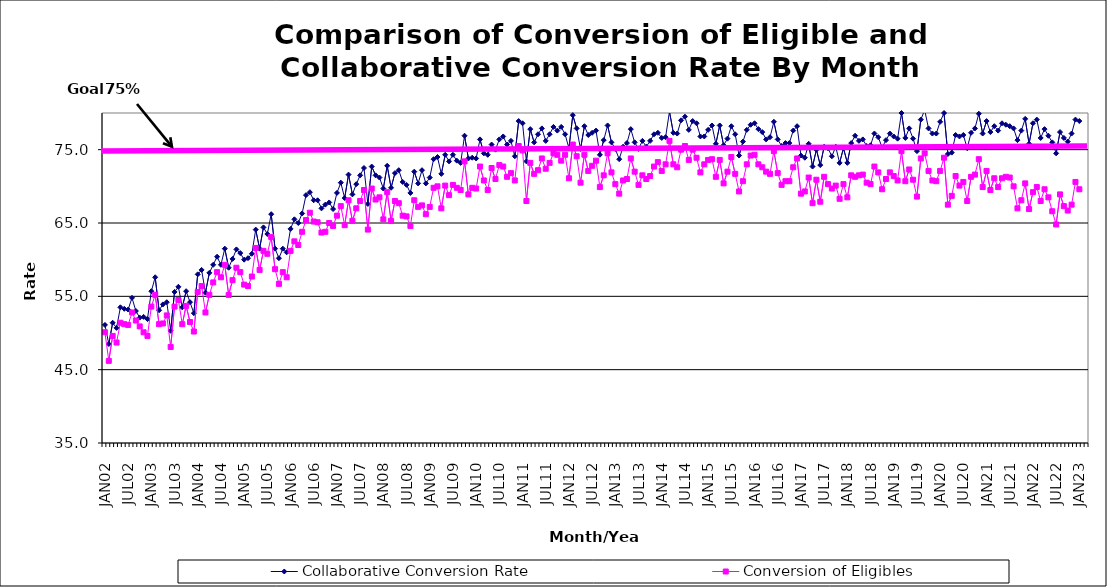
| Category | Collaborative Conversion Rate | Conversion of Eligibles |
|---|---|---|
| JAN02 | 51.1 | 50.1 |
| FEB02 | 48.5 | 46.2 |
| MAR02 | 51.4 | 49.6 |
| APR02 | 50.7 | 48.7 |
| MAY02 | 53.5 | 51.4 |
| JUN02 | 53.3 | 51.2 |
| JUL02 | 53.2 | 51.1 |
| AUG02 | 54.8 | 52.8 |
| SEP02 | 53 | 51.7 |
| OCT02 | 52.1 | 50.9 |
| NOV02 | 52.2 | 50.1 |
| DEC02 | 51.9 | 49.6 |
| JAN03 | 55.7 | 53.6 |
| FEB03 | 57.6 | 55.2 |
| MAR03 | 53.1 | 51.2 |
| APR03 | 53.9 | 51.3 |
| MAY03 | 54.2 | 52.4 |
| JUN03 | 50.3 | 48.1 |
| JUL03 | 55.6 | 53.6 |
| AUG03 | 56.3 | 54.5 |
| SEP03 | 53.5 | 51.2 |
| OCT03 | 55.7 | 53.7 |
| NOV03 | 54.2 | 51.5 |
| DEC03 | 52.7 | 50.2 |
| JAN04 | 58 | 55.6 |
| FEB04 | 58.6 | 56.4 |
| MAR04 | 55.5 | 52.8 |
| APR04 | 58.2 | 55.2 |
| MAY04 | 59.3 | 56.9 |
| JUN04 | 60.4 | 58.3 |
| JUL04 | 59.3 | 57.6 |
| AUG04 | 61.5 | 59.3 |
| SEP04 | 58.9 | 55.2 |
| OCT04 | 60.1 | 57.2 |
| NOV04 | 61.4 | 58.9 |
| DEC04 | 60.9 | 58.3 |
| JAN05 | 60 | 56.6 |
| FEB05 | 60.2 | 56.4 |
| MAR05 | 60.8 | 57.7 |
| APR05 | 64.1 | 61.6 |
| MAY05 | 61.5 | 58.6 |
| JUN05 | 64.4 | 61.2 |
| JUL05 | 63.5 | 60.8 |
| AUG05 | 66.2 | 63.1 |
| SEP05 | 61.5 | 58.7 |
| OCT05 | 60.2 | 56.7 |
| NOV05 | 61.5 | 58.3 |
| DEC05 | 61 | 57.6 |
| JAN06 | 64.2 | 61.2 |
| FEB06 | 65.5 | 62.5 |
| MAR06 | 65 | 62 |
| APR06 | 66.3 | 63.8 |
| MAY06 | 68.8 | 65.4 |
| JUN06 | 69.2 | 66.4 |
| JUL06 | 68.1 | 65.2 |
| AUG06 | 68.1 | 65.1 |
| SEP06 | 67 | 63.7 |
| OCT06 | 67.5 | 63.8 |
| NOV06 | 67.8 | 65 |
| DEC06 | 66.9 | 64.6 |
| JAN07 | 69.1 | 66 |
| FEB07 | 70.5 | 67.3 |
| MAR07 | 68.4 | 64.7 |
| APR07 | 71.6 | 68.1 |
| MAY07 | 68.9 | 65.3 |
| JUN07 | 70.3 | 67 |
| JUL07 | 71.5 | 68 |
| AUG07 | 72.5 | 69.5 |
| SEP07 | 67.6 | 64.1 |
| OCT07 | 72.7 | 69.7 |
| NOV07 | 71.5 | 68.2 |
| DEC07 | 71.2 | 68.5 |
| JAN08 | 69.7 | 65.5 |
| FEB08 | 72.8 | 69.2 |
| MAR08 | 69.8 | 65.3 |
| APR08 | 71.8 | 68 |
| MAY08 | 72.2 | 67.7 |
| JUN08 | 70.6 | 66 |
| JUL08 | 70.2 | 65.9 |
| AUG08 | 69.1 | 64.6 |
| SEP08 | 72 | 68.1 |
| OCT08 | 70.4 | 67.2 |
| NOV08 | 72.2 | 67.4 |
| DEC08 | 70.4 | 66.2 |
| JAN09 | 71.2 | 67.2 |
| FEB09 | 73.7 | 69.8 |
| MAR09 | 74 | 70 |
| APR09 | 71.7 | 67 |
| MAY09 | 74.3 | 70.1 |
| JUN09 | 73.4 | 68.8 |
| JUL09 | 74.3 | 70.2 |
| AUG09 | 73.5 | 69.8 |
| SEP09 | 73.2 | 69.5 |
| OCT09 | 76.9 | 73.4 |
| NOV09 | 73.8 | 68.9 |
| DEC09 | 73.9 | 69.8 |
| JAN10 | 73.8 | 69.7 |
| FEB10 | 76.4 | 72.7 |
| MAR10 | 74.5 | 70.8 |
| APR10 | 74.3 | 69.5 |
| MAY10 | 75.7 | 72.5 |
| JUN10 | 75 | 71 |
| JUL10 | 76.4 | 72.9 |
| AUG10 | 76.8 | 72.7 |
| SEP10 | 75.7 | 71.3 |
| OCT10 | 76.2 | 71.8 |
| NOV10 | 74.1 | 70.8 |
| DEC10 | 78.9 | 75.5 |
| JAN11 | 78.6 | 74.9 |
| FEB11 | 73.4 | 68 |
| MAR11 | 77.8 | 73.2 |
| APR11 | 76 | 71.7 |
| MAY11 | 77.1 | 72.2 |
| JUN11 | 77.9 | 73.8 |
| JUL11 | 76.2 | 72.4 |
| AUG11 | 77.1 | 73.2 |
| SEP11 | 78.1 | 74.5 |
| OCT11 | 77.6 | 74.3 |
| NOV11 | 78.1 | 73.5 |
| DEC11 | 77.1 | 74.3 |
| JAN12 | 75.2 | 71.1 |
| FEB12 | 79.7 | 75.7 |
| MAR12 | 77.9 | 74.1 |
| APR12 | 75.1 | 70.5 |
| MAY12 | 78.2 | 74.3 |
| JUN12 | 77 | 72.1 |
| JUL12 | 77.3 | 72.8 |
| AUG12 | 77.6 | 73.5 |
| SEP12 | 74.3 | 69.9 |
| OCT12 | 76.3 | 71.5 |
| NOV12 | 78.3 | 74.5 |
| DEC12 | 76 | 71.9 |
| JAN13 | 75.1 | 70.3 |
| FEB13 | 73.7 | 69 |
| MAR13 | 75.4 | 70.8 |
| APR13 | 75.9 | 71 |
| MAY13 | 77.8 | 73.8 |
| JUN13 | 76 | 72 |
| JUL13 | 75.1 | 70.2 |
| AUG13 | 76.2 | 71.5 |
| SEP13 | 75.4 | 71 |
| OCT13 | 76.2 | 71.4 |
| NOV13 | 77.1 | 72.7 |
| DEC13 | 77.3 | 73.3 |
| JAN14 | 76.6 | 72.1 |
| FEB14 | 76.7 | 73 |
| MAR14 | 80.2 | 76.2 |
| APR14 | 77.3 | 73 |
| MAY14 | 77.2 | 72.6 |
| JUN14 | 79 | 75 |
| JUL14 | 79.5 | 75.5 |
| AUG14 | 77.7 | 73.6 |
| SEP14 | 78.9 | 75 |
| OCT14 | 78.6 | 73.9 |
| NOV14 | 76.8 | 71.9 |
| DEC14 | 76.8 | 73 |
| JAN15 | 77.7 | 73.6 |
| FEB15 | 78.3 | 73.7 |
| MAR15 | 75.8 | 71.3 |
| APR15 | 78.3 | 73.6 |
| MAY15 | 75.6 | 70.4 |
| JUN15 | 76.5 | 72 |
| JUL15 | 78.2 | 74 |
| AUG15 | 77.1 | 71.7 |
| SEP15 | 74.2 | 69.3 |
| OCT15 | 76.1 | 70.7 |
| NOV15 | 77.7 | 73 |
| DEC15 | 78.4 | 74.2 |
| JAN16 | 78.6 | 74.3 |
| FEB16 | 77.8 | 73 |
| MAR16 | 77.4 | 72.6 |
| APR16 | 76.4 | 72 |
| MAY16 | 76.7 | 71.7 |
| JUN16 | 78.8 | 74.8 |
| JUL16 | 76.4 | 71.8 |
| AUG16 | 75.5 | 70.2 |
| SEP16 | 75.9 | 70.7 |
| OCT16 | 75.9 | 70.7 |
| NOV16 | 77.6 | 72.6 |
| DEC16 | 78.2 | 73.8 |
| JAN17 | 74.2 | 69 |
| FEB17 | 73.9 | 69.3 |
| MAR17 | 75.8 | 71.2 |
| APR17 | 72.7 | 67.7 |
| MAY17 | 75 | 70.9 |
| JUN17 | 72.9 | 67.9 |
| JUL17 | 75.4 | 71.3 |
| AUG17 | 75.2 | 70.3 |
| SEP17 | 74.1 | 69.7 |
| OCT17 | 75.4 | 70.1 |
| NOV17 | 73.2 | 68.3 |
| DEC17 | 75.2 | 70.3 |
| JAN18 | 73.2 | 68.5 |
| FEB18 | 75.9 | 71.5 |
| MAR18 | 76.9 | 71.3 |
| APR18 | 76.2 | 71.5 |
| MAY18 | 76.4 | 71.6 |
| JUN18 | 75.5 | 70.5 |
| JUL18 | 75.6 | 70.3 |
| AUG18 | 77.2 | 72.7 |
| SEP18 | 76.7 | 71.9 |
| OCT18 | 75.3 | 69.6 |
| NOV18 | 76.3 | 71 |
| DEC18 | 77.2 | 71.9 |
| JAN19 | 76.8 | 71.4 |
| FEB19 | 76.5 | 70.8 |
| MAR19 | 80 | 74.8 |
| APR19 | 76.6 | 70.7 |
| MAY19 | 77.9 | 72.3 |
| JUN19 | 76.5 | 70.9 |
| JUL19 | 74.8 | 68.6 |
| AUG19 | 79.1 | 73.8 |
| SEP19 | 80.4 | 74.5 |
| OCT19 | 77.9 | 72.1 |
| NOV19 | 77.2 | 70.8 |
| DEC19 | 77.2 | 70.7 |
| JAN20 | 78.8 | 72.1 |
| FEB20 | 80 | 73.9 |
| MAR20 | 74.4 | 67.5 |
| APR20 | 74.6 | 68.7 |
| MAY20 | 77 | 71.4 |
| JUN20 | 76.8 | 70.1 |
| JUL20 | 77 | 70.6 |
| AUG20 | 75.2 | 68 |
| SEP20 | 77.3 | 71.3 |
| OCT20 | 77.9 | 71.6 |
| NOV20 | 79.9 | 73.7 |
| DEC20 | 77.2 | 69.9 |
| JAN21 | 78.9 | 72.1 |
| FEB21 | 77.4 | 69.5 |
| MAR21 | 78.2 | 71.1 |
| APR21 | 77.6 | 69.9 |
| MAY21 | 78.6 | 71.1 |
| JUN21 | 78.4 | 71.3 |
| JUL21 | 78.2 | 71.2 |
| AUG21 | 77.9 | 70 |
| SEP21 | 76.3 | 67 |
| OCT21 | 77.6 | 68.1 |
| NOV21 | 79.2 | 70.4 |
| DEC21 | 75.8 | 66.9 |
| JAN22 | 78.6 | 69.2 |
| FEB22 | 79.1 | 69.9 |
| MAR22 | 76.6 | 68 |
| APR22 | 77.8 | 69.6 |
| MAY22 | 76.9 | 68.5 |
| JUN22 | 76 | 66.6 |
| JUL22 | 74.5 | 64.8 |
| AUG22 | 77.4 | 68.9 |
| SEP22 | 76.6 | 67.3 |
| OCT22 | 76.1 | 66.7 |
| NOV22 | 77.2 | 67.5 |
| DEC22 | 79.1 | 70.6 |
| JAN23 | 78.9 | 69.6 |